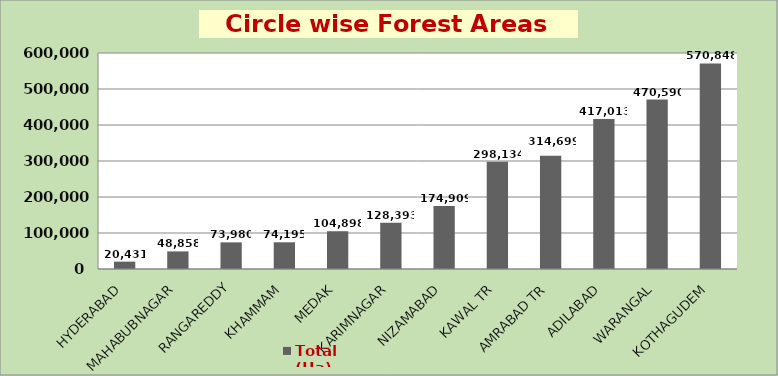
| Category | Total (Ha) |
|---|---|
| HYDERABAD | 20431.39 |
| MAHABUBNAGAR | 48857.74 |
| RANGAREDDY | 73980.19 |
| KHAMMAM | 74195.45 |
| MEDAK | 104898.19 |
| KARIMNAGAR | 128393.13 |
| NIZAMABAD | 174908.64 |
| KAWAL TR | 298133.89 |
| AMRABAD TR | 314698.84 |
| ADILABAD | 417013.1 |
| WARANGAL | 470590.44 |
| KOTHAGUDEM | 570847.55 |